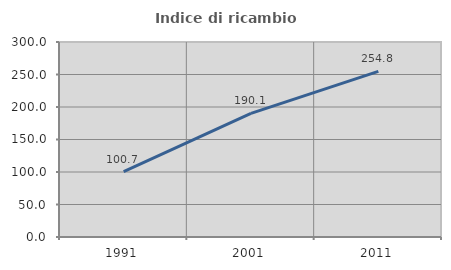
| Category | Indice di ricambio occupazionale  |
|---|---|
| 1991.0 | 100.725 |
| 2001.0 | 190.123 |
| 2011.0 | 254.795 |